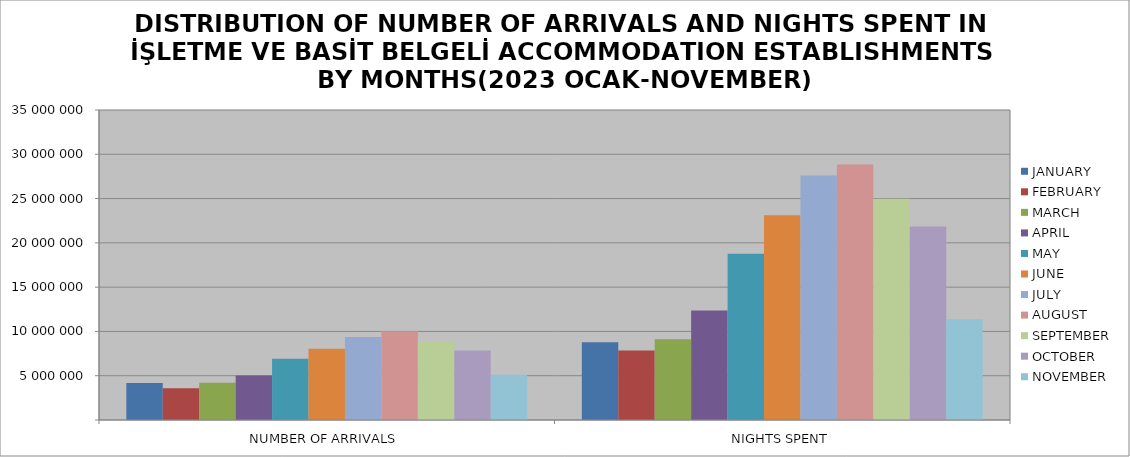
| Category | JANUARY | FEBRUARY | MARCH | APRIL | MAY | JUNE | JULY | AUGUST | SEPTEMBER | OCTOBER | NOVEMBER |
|---|---|---|---|---|---|---|---|---|---|---|---|
| NUMBER OF ARRIVALS | 4176369 | 3577989 | 4200030 | 5022587 | 6927000 | 8050681 | 9379348 | 10028953 | 8800056 | 7838230 | 5119651 |
| NIGHTS SPENT | 8783046 | 7837722 | 9122802 | 12360237 | 18778808 | 23106038 | 27617279 | 28851182 | 24974127 | 21858050 | 11363529 |